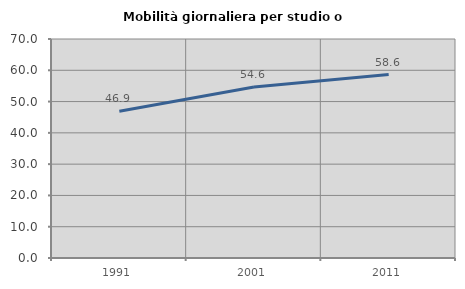
| Category | Mobilità giornaliera per studio o lavoro |
|---|---|
| 1991.0 | 46.931 |
| 2001.0 | 54.639 |
| 2011.0 | 58.626 |